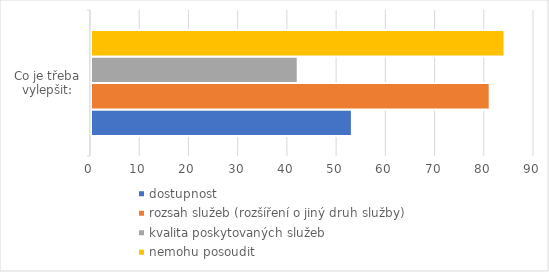
| Category | dostupnost  | rozsah služeb (rozšíření o jiný druh služby) | kvalita poskytovaných služeb | nemohu posoudit |
|---|---|---|---|---|
| 0 | 53 | 81 | 42 | 84 |